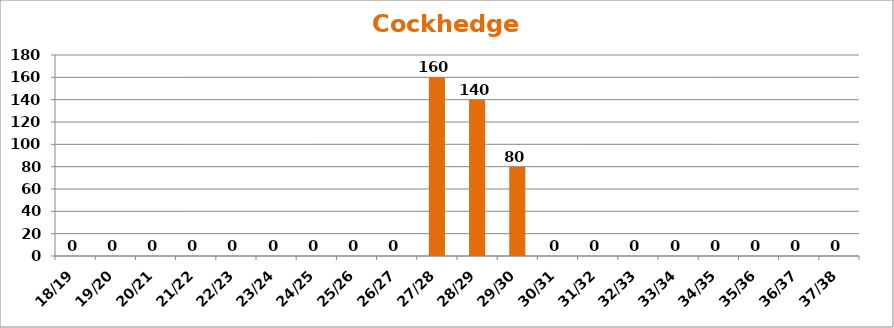
| Category | Cockhedge Quarter |
|---|---|
| 18/19 | 0 |
| 19/20 | 0 |
| 20/21 | 0 |
| 21/22 | 0 |
| 22/23 | 0 |
| 23/24 | 0 |
| 24/25 | 0 |
| 25/26 | 0 |
| 26/27 | 0 |
| 27/28 | 160 |
| 28/29 | 140 |
| 29/30 | 80 |
| 30/31 | 0 |
| 31/32 | 0 |
| 32/33 | 0 |
| 33/34 | 0 |
| 34/35 | 0 |
| 35/36 | 0 |
| 36/37 | 0 |
| 37/38 | 0 |